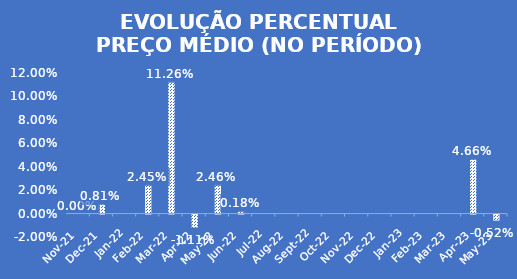
| Category | Series 0 |
|---|---|
| 2021-11-01 | 0 |
| 2021-12-01 | 0.008 |
| 2022-02-01 | 0.024 |
| 2022-03-01 | 0.113 |
| 2022-04-01 | -0.011 |
| 2022-05-01 | 0.025 |
| 2022-06-01 | 0.002 |
| 2023-04-08 | 0.047 |
| 2023-05-08 | -0.005 |